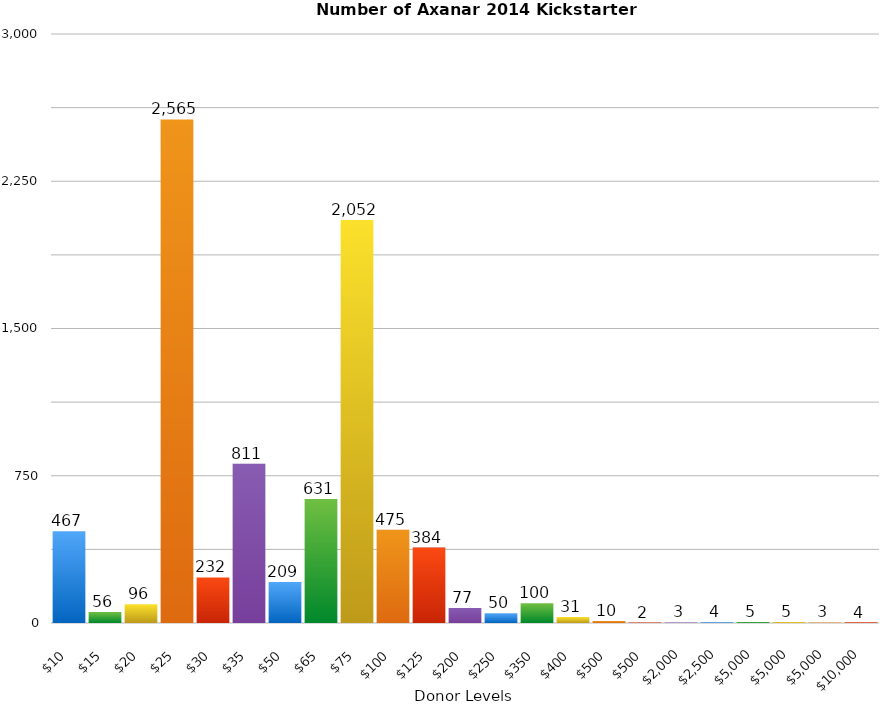
| Category | No. of Backers |
|---|---|
| $10 | 467 |
| $15 | 56 |
| $20 | 96 |
| $25 | 2565 |
| $30 | 232 |
| $35 | 811 |
| $50 | 209 |
| $65 | 631 |
| $75 | 2052 |
| $100 | 475 |
| $125 | 384 |
| $200 | 77 |
| $250 | 50 |
| $350 | 100 |
| $400 | 31 |
| $500 | 10 |
| $500 | 2 |
| $2,000 | 3 |
| $2,500 | 4 |
| $5,000 | 5 |
| $5,000 | 5 |
| $5,000 | 3 |
| $10,000 | 4 |